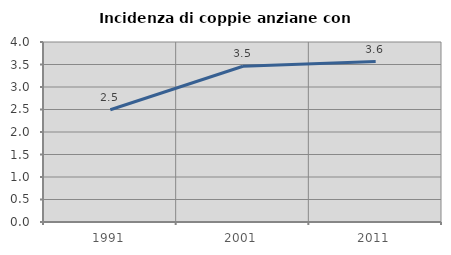
| Category | Incidenza di coppie anziane con figli |
|---|---|
| 1991.0 | 2.495 |
| 2001.0 | 3.462 |
| 2011.0 | 3.566 |